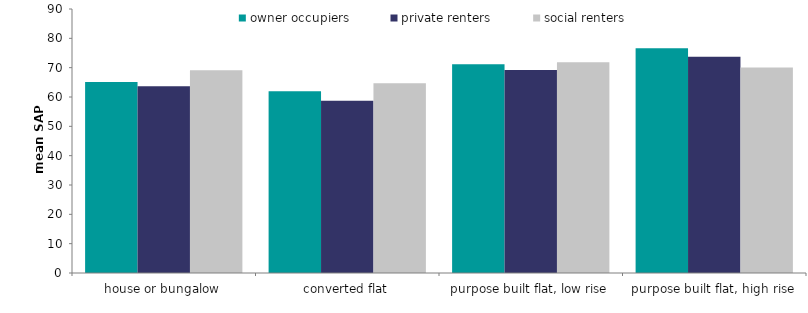
| Category | owner occupiers | private renters | social renters |
|---|---|---|---|
| house or bungalow | 65.155 | 63.669 | 69.11 |
| converted flat | 61.961 | 58.719 | 64.663 |
| purpose built flat, low rise | 71.171 | 69.227 | 71.855 |
| purpose built flat, high rise | 76.615 | 73.722 | 70.086 |